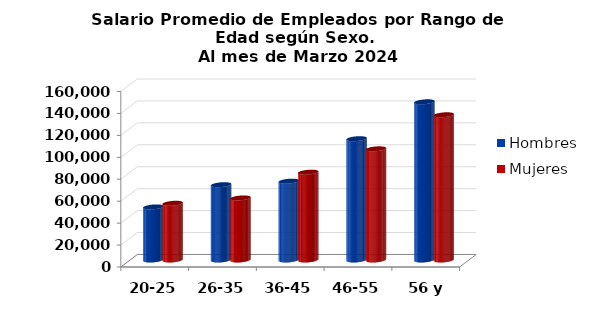
| Category | Hombres | Mujeres |
|---|---|---|
| 20-25 | 48421.4 | 51720 |
| 26-35 | 68673.457 | 56589.893 |
| 36-45 | 71878.122 | 80059.613 |
| 46-55 | 110612.643 | 101360.552 |
| 56 y más | 144246.5 | 132407.989 |